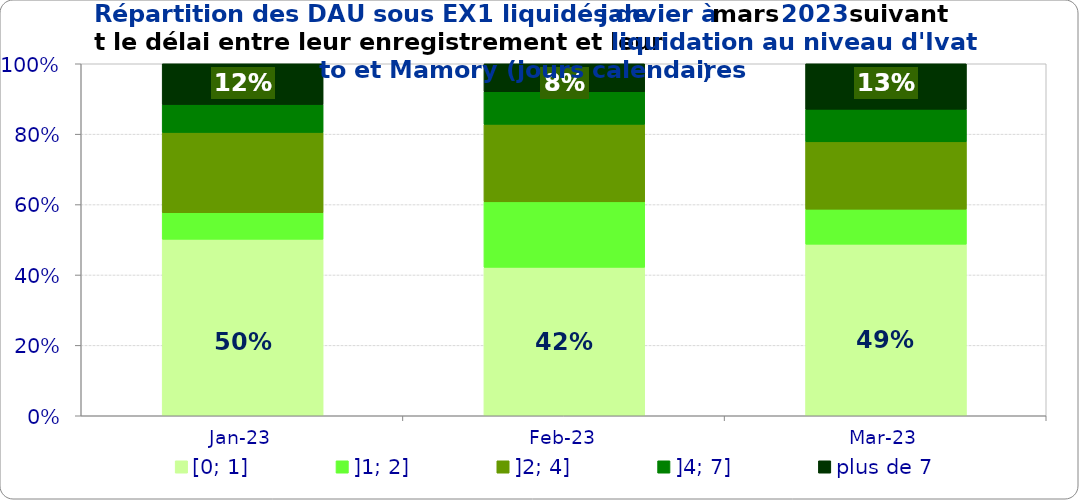
| Category | [0; 1] | ]1; 2] | ]2; 4] | ]4; 7] | plus de 7 |
|---|---|---|---|---|---|
| 2023-01-01 | 0.501 | 0.076 | 0.228 | 0.079 | 0.116 |
| 2023-02-01 | 0.422 | 0.186 | 0.22 | 0.093 | 0.08 |
| 2023-03-01 | 0.487 | 0.1 | 0.191 | 0.092 | 0.129 |